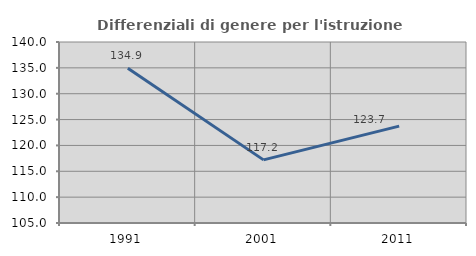
| Category | Differenziali di genere per l'istruzione superiore |
|---|---|
| 1991.0 | 134.912 |
| 2001.0 | 117.205 |
| 2011.0 | 123.727 |